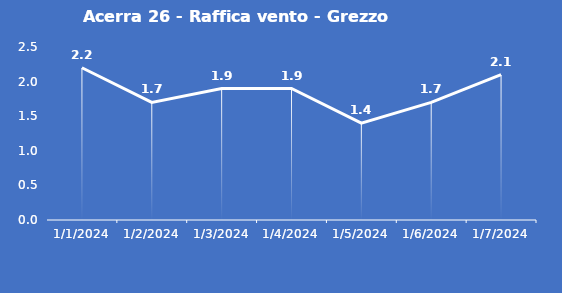
| Category | Acerra 26 - Raffica vento - Grezzo (m/s) |
|---|---|
| 1/1/24 | 2.2 |
| 1/2/24 | 1.7 |
| 1/3/24 | 1.9 |
| 1/4/24 | 1.9 |
| 1/5/24 | 1.4 |
| 1/6/24 | 1.7 |
| 1/7/24 | 2.1 |